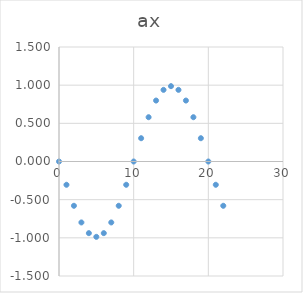
| Category | Series 0 |
|---|---|
| 0.0 | 0 |
| 1.0 | -0.305 |
| 2.0 | -0.58 |
| 3.0 | -0.798 |
| 4.0 | -0.939 |
| 5.0 | -0.987 |
| 6.0 | -0.939 |
| 7.0 | -0.798 |
| 8.0 | -0.58 |
| 9.0 | -0.305 |
| 10.0 | 0 |
| 11.0 | 0.305 |
| 12.0 | 0.58 |
| 13.0 | 0.798 |
| 14.0 | 0.939 |
| 15.0 | 0.987 |
| 16.0 | 0.939 |
| 17.0 | 0.798 |
| 18.0 | 0.58 |
| 19.0 | 0.305 |
| 20.0 | 0 |
| 21.0 | -0.305 |
| 22.0 | -0.58 |